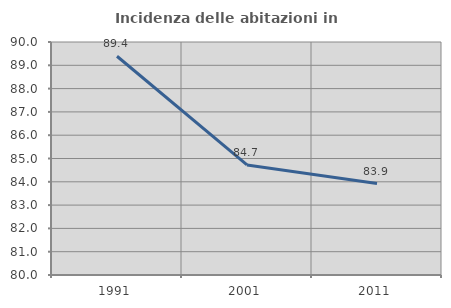
| Category | Incidenza delle abitazioni in proprietà  |
|---|---|
| 1991.0 | 89.388 |
| 2001.0 | 84.726 |
| 2011.0 | 83.927 |